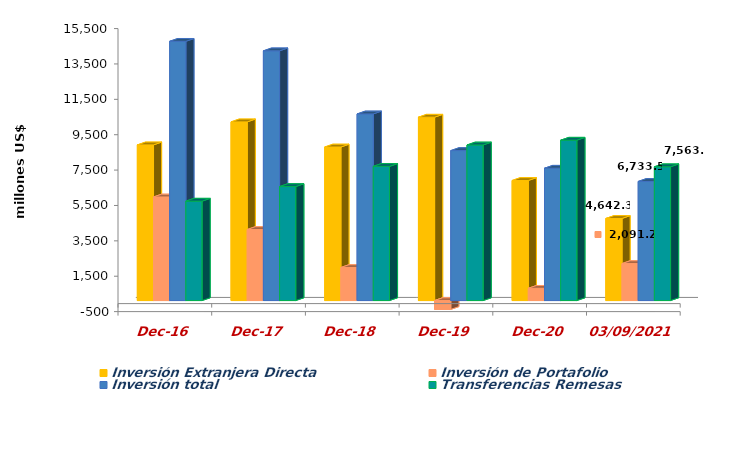
| Category | Inversión Extranjera Directa | Inversión de Portafolio | Inversión total | Transferencias Remesas |
|---|---|---|---|---|
| dic-16 | 8799.902 | 5855.627 | 14655.528 | 5618.91 |
| dic-17 | 10100.831 | 4016.258 | 14117.09 | 6443.7 |
| dic-18 | 8679.228 | 1869.902 | 10549.13 | 7584.996 |
| dic-19 | 10366.079 | -1887.91 | 8478.169 | 8795.131 |
| dic-20 | 6788.042 | 692.839 | 7480.88 | 9065.673 |
| 03/09/2021 | 4642.28 | 2091.204 | 6733.484 | 7563.865 |